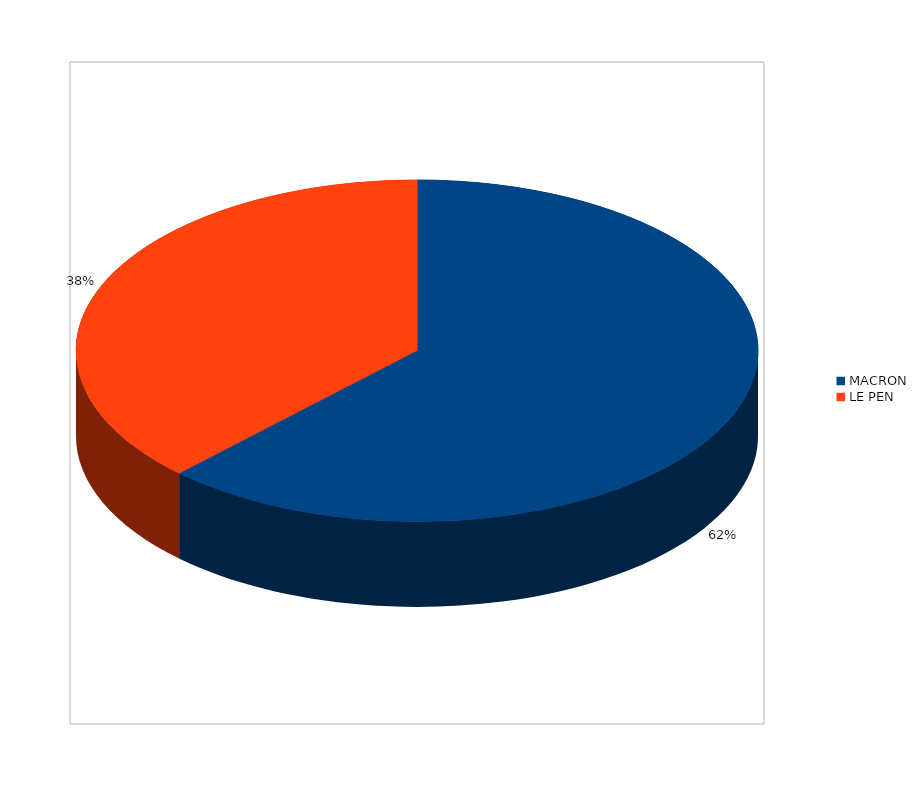
| Category | Series 0 |
|---|---|
| MACRON | 1643 |
| LE PEN | 996 |